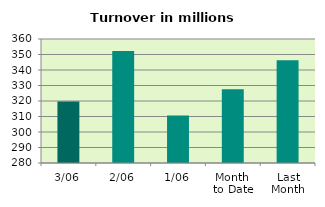
| Category | Series 0 |
|---|---|
| 3/06 | 319.715 |
| 2/06 | 352.315 |
| 1/06 | 310.662 |
| Month 
to Date | 327.564 |
| Last
Month | 346.329 |